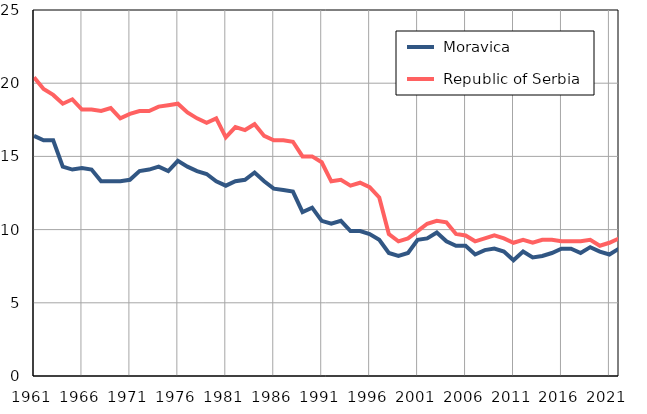
| Category |  Moravica |  Republic of Serbia |
|---|---|---|
| 1961.0 | 16.4 | 20.4 |
| 1962.0 | 16.1 | 19.6 |
| 1963.0 | 16.1 | 19.2 |
| 1964.0 | 14.3 | 18.6 |
| 1965.0 | 14.1 | 18.9 |
| 1966.0 | 14.2 | 18.2 |
| 1967.0 | 14.1 | 18.2 |
| 1968.0 | 13.3 | 18.1 |
| 1969.0 | 13.3 | 18.3 |
| 1970.0 | 13.3 | 17.6 |
| 1971.0 | 13.4 | 17.9 |
| 1972.0 | 14 | 18.1 |
| 1973.0 | 14.1 | 18.1 |
| 1974.0 | 14.3 | 18.4 |
| 1975.0 | 14 | 18.5 |
| 1976.0 | 14.7 | 18.6 |
| 1977.0 | 14.3 | 18 |
| 1978.0 | 14 | 17.6 |
| 1979.0 | 13.8 | 17.3 |
| 1980.0 | 13.3 | 17.6 |
| 1981.0 | 13 | 16.3 |
| 1982.0 | 13.3 | 17 |
| 1983.0 | 13.4 | 16.8 |
| 1984.0 | 13.9 | 17.2 |
| 1985.0 | 13.3 | 16.4 |
| 1986.0 | 12.8 | 16.1 |
| 1987.0 | 12.7 | 16.1 |
| 1988.0 | 12.6 | 16 |
| 1989.0 | 11.2 | 15 |
| 1990.0 | 11.5 | 15 |
| 1991.0 | 10.6 | 14.6 |
| 1992.0 | 10.4 | 13.3 |
| 1993.0 | 10.6 | 13.4 |
| 1994.0 | 9.9 | 13 |
| 1995.0 | 9.9 | 13.2 |
| 1996.0 | 9.7 | 12.9 |
| 1997.0 | 9.3 | 12.2 |
| 1998.0 | 8.4 | 9.7 |
| 1999.0 | 8.2 | 9.2 |
| 2000.0 | 8.4 | 9.4 |
| 2001.0 | 9.3 | 9.9 |
| 2002.0 | 9.4 | 10.4 |
| 2003.0 | 9.8 | 10.6 |
| 2004.0 | 9.2 | 10.5 |
| 2005.0 | 8.9 | 9.7 |
| 2006.0 | 8.9 | 9.6 |
| 2007.0 | 8.3 | 9.2 |
| 2008.0 | 8.6 | 9.4 |
| 2009.0 | 8.7 | 9.6 |
| 2010.0 | 8.5 | 9.4 |
| 2011.0 | 7.9 | 9.1 |
| 2012.0 | 8.5 | 9.3 |
| 2013.0 | 8.1 | 9.1 |
| 2014.0 | 8.2 | 9.3 |
| 2015.0 | 8.4 | 9.3 |
| 2016.0 | 8.7 | 9.2 |
| 2017.0 | 8.7 | 9.2 |
| 2018.0 | 8.4 | 9.2 |
| 2019.0 | 8.8 | 9.3 |
| 2020.0 | 8.5 | 8.9 |
| 2021.0 | 8.3 | 9.1 |
| 2022.0 | 8.7 | 9.4 |